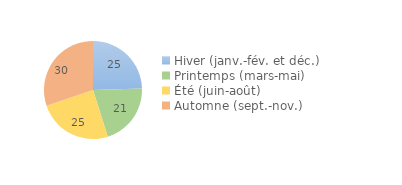
| Category | Series 0 |
|---|---|
| Hiver (janv.-fév. et déc.) | 24.5 |
| Printemps (mars-mai) | 20.61 |
| Été (juin-août) | 24.71 |
| Automne (sept.-nov.) | 30.18 |